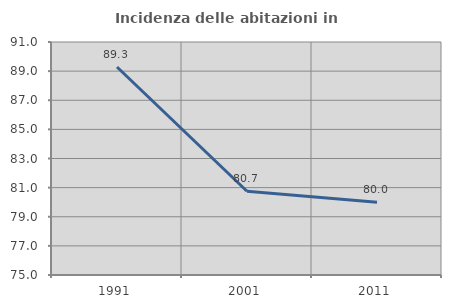
| Category | Incidenza delle abitazioni in proprietà  |
|---|---|
| 1991.0 | 89.286 |
| 2001.0 | 80.749 |
| 2011.0 | 80 |